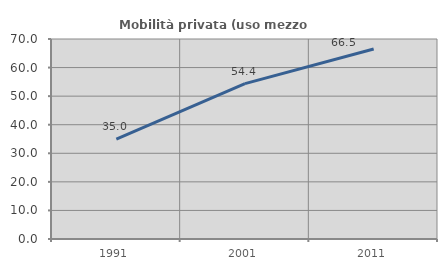
| Category | Mobilità privata (uso mezzo privato) |
|---|---|
| 1991.0 | 34.954 |
| 2001.0 | 54.366 |
| 2011.0 | 66.481 |